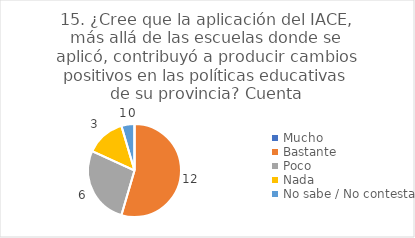
| Category | 15. ¿Cree que la aplicación del IACE, más allá de las escuelas donde se aplicó, contribuyó a producir cambios positivos en las políticas educativas de su provincia? |
|---|---|
| Mucho  | 0 |
| Bastante  | 0.545 |
| Poco  | 0.273 |
| Nada  | 0.136 |
| No sabe / No contesta | 0.045 |